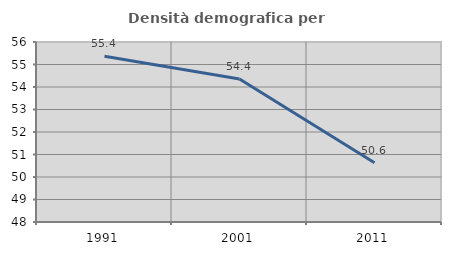
| Category | Densità demografica |
|---|---|
| 1991.0 | 55.366 |
| 2001.0 | 54.358 |
| 2011.0 | 50.634 |